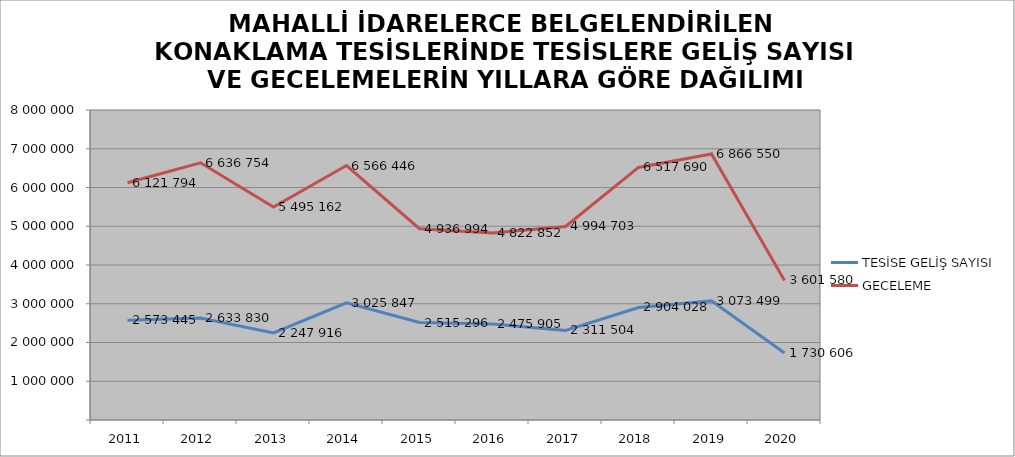
| Category | TESİSE GELİŞ SAYISI | GECELEME |
|---|---|---|
| 2011 | 2573445 | 6121794 |
| 2012 | 2633830 | 6636754 |
| 2013 | 2247916 | 5495162 |
| 2014 | 3025847 | 6566446 |
| 2015 | 2515296 | 4936994 |
| 2016 | 2475905 | 4822852 |
| 2017 | 2311504 | 4994703 |
| 2018 | 2904028 | 6517690 |
| 2019 | 3073499 | 6866550 |
| 2020 | 1730606 | 3601580 |